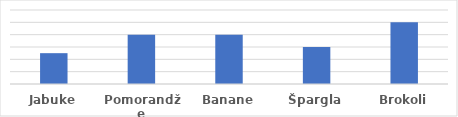
| Category | Količina |
|---|---|
| Jabuke | 500 |
| Pomorandže | 800 |
| Banane | 800 |
| Špargla | 600 |
| Brokoli | 1000 |